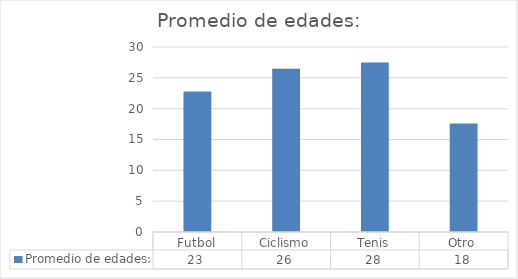
| Category | Promedio de edades: |
|---|---|
| Futbol | 22.769 |
| Ciclismo | 26.455 |
| Tenis | 27.5 |
| Otro | 17.6 |